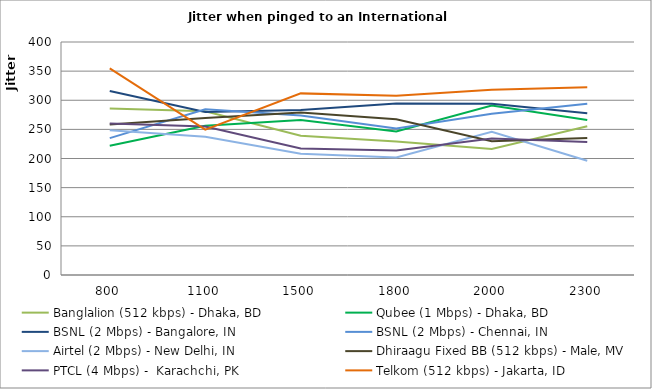
| Category | Banglalion (512 kbps) - Dhaka, BD | Qubee (1 Mbps) - Dhaka, BD | BSNL (2 Mbps) - Bangalore, IN | BSNL (2 Mbps) - Chennai, IN | Airtel (2 Mbps) - New Delhi, IN | Dhiraagu Fixed BB (512 kbps) - Male, MV | PTCL (4 Mbps) -  Karachchi, PK | Telkom (512 kbps) - Jakarta, ID |
|---|---|---|---|---|---|---|---|---|
| 800.0 | 286 | 222 | 316 | 235 | 248.4 | 258.308 | 260.167 | 354.833 |
| 1100.0 | 281.25 | 256.25 | 279.75 | 284.5 | 237.5 | 269.5 | 254.857 | 249.667 |
| 1500.0 | 239 | 266.25 | 283.25 | 274 | 208 | 278.923 | 217 | 311.8 |
| 1800.0 | 229.25 | 246.5 | 294.25 | 251.667 | 201.75 | 267.231 | 213.857 | 307.833 |
| 2000.0 | 216.25 | 291 | 294 | 276.75 | 246 | 229.75 | 234.333 | 317.833 |
| 2300.0 | 255.5 | 266 | 277.75 | 294 | 196.25 | 235.333 | 228.167 | 322.25 |